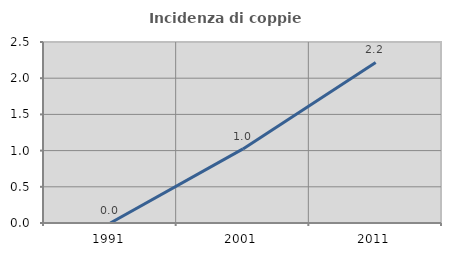
| Category | Incidenza di coppie miste |
|---|---|
| 1991.0 | 0 |
| 2001.0 | 1.023 |
| 2011.0 | 2.217 |